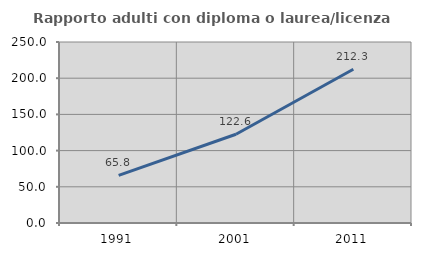
| Category | Rapporto adulti con diploma o laurea/licenza media  |
|---|---|
| 1991.0 | 65.806 |
| 2001.0 | 122.581 |
| 2011.0 | 212.295 |